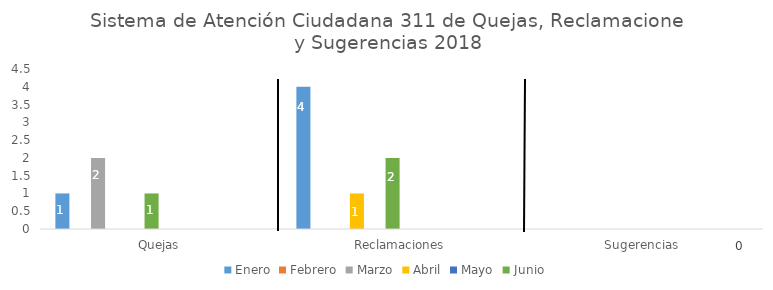
| Category | Enero | Febrero | Marzo | Abril | Mayo | Junio | Julio | Agosto | Septiembre | Octubre | Noviembre | Diciembre |
|---|---|---|---|---|---|---|---|---|---|---|---|---|
| Quejas | 1 | 0 | 2 | 0 | 0 | 1 | 0 | 0 | 0 | 0 | 0 | 0 |
| Reclamaciones | 4 | 0 | 0 | 1 | 0 | 2 | 0 | 0 | 0 | 0 | 0 | 0 |
| Sugerencias | 0 | 0 | 0 | 0 | 0 | 0 | 0 | 0 | 0 | 0 | 0 | 0 |